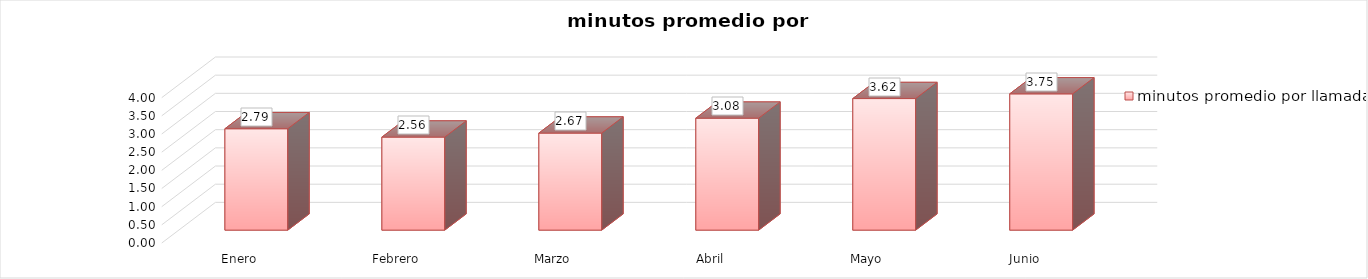
| Category | minutos promedio por llamada |
|---|---|
| Enero | 2.79 |
| Febrero | 2.56 |
| Marzo | 2.67 |
| Abril | 3.08 |
| Mayo | 3.62 |
| Junio | 3.75 |